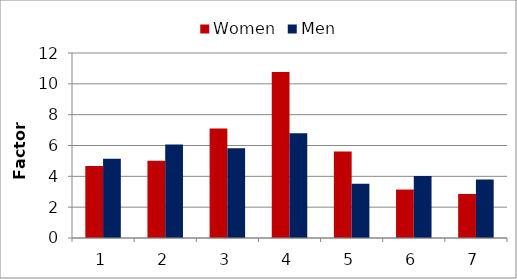
| Category | Women | Men |
|---|---|---|
| 1.0 | 4.664 | 5.138 |
| 2.0 | 5.014 | 6.066 |
| 3.0 | 7.108 | 5.828 |
| 4.0 | 10.774 | 6.792 |
| 5.0 | 5.611 | 3.52 |
| 6.0 | 3.143 | 4.026 |
| 7.0 | 2.857 | 3.789 |